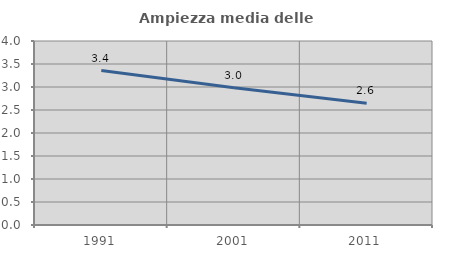
| Category | Ampiezza media delle famiglie |
|---|---|
| 1991.0 | 3.359 |
| 2001.0 | 2.983 |
| 2011.0 | 2.647 |